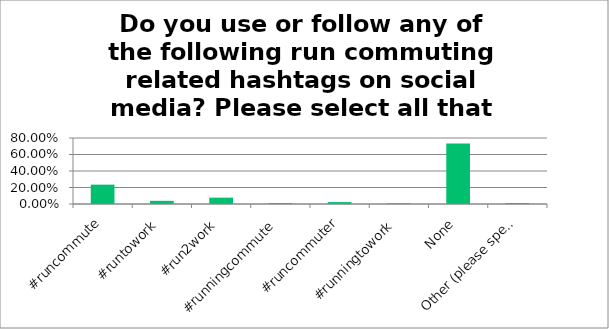
| Category | Responses |
|---|---|
| #runcommute | 0.235 |
| #runtowork | 0.038 |
| #run2work | 0.077 |
| #runningcommute | 0.012 |
| #runcommuter | 0.023 |
| #runningtowork | 0.008 |
| None | 0.735 |
| Other (please specify) | 0.012 |